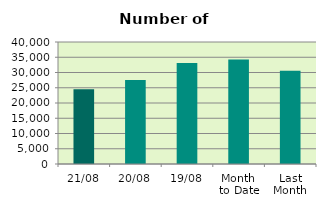
| Category | Series 0 |
|---|---|
| 21/08 | 24482 |
| 20/08 | 27506 |
| 19/08 | 33116 |
| Month 
to Date | 34290.933 |
| Last
Month | 30613.13 |